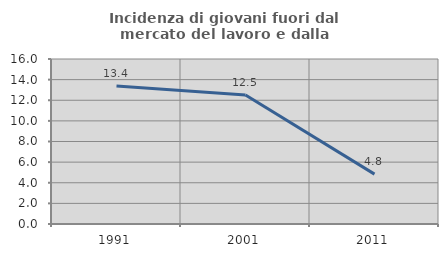
| Category | Incidenza di giovani fuori dal mercato del lavoro e dalla formazione  |
|---|---|
| 1991.0 | 13.389 |
| 2001.0 | 12.5 |
| 2011.0 | 4.839 |